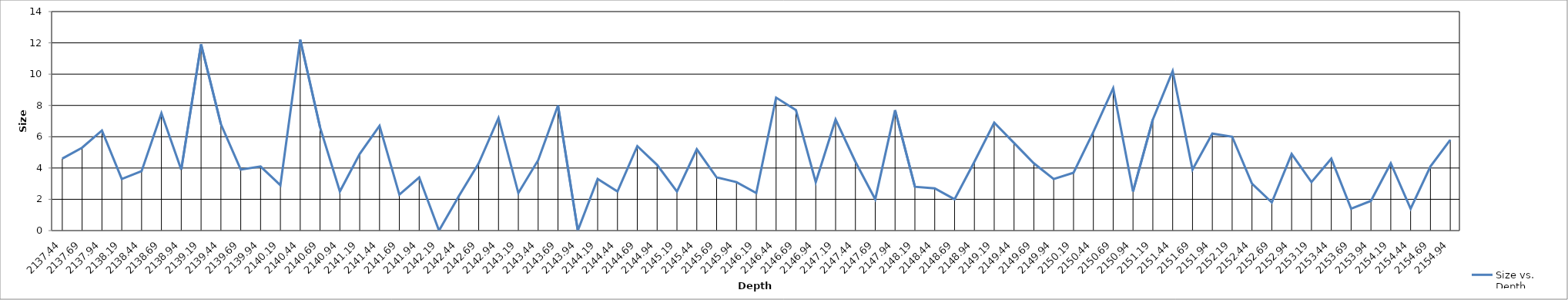
| Category | Size vs. Depth |
|---|---|
| 2137.44 | 4.6 |
| 2137.69 | 5.3 |
| 2137.94 | 6.4 |
| 2138.19 | 3.3 |
| 2138.44 | 3.8 |
| 2138.69 | 7.5 |
| 2138.94 | 3.9 |
| 2139.19 | 11.9 |
| 2139.44 | 6.8 |
| 2139.69 | 3.9 |
| 2139.94 | 4.1 |
| 2140.19 | 2.9 |
| 2140.44 | 12.2 |
| 2140.69 | 6.6 |
| 2140.94 | 2.5 |
| 2141.19 | 4.9 |
| 2141.44 | 6.7 |
| 2141.69 | 2.3 |
| 2141.94 | 3.4 |
| 2142.19 | 0 |
| 2142.44 | 2.2 |
| 2142.69 | 4.3 |
| 2142.94 | 7.2 |
| 2143.19 | 2.4 |
| 2143.44 | 4.5 |
| 2143.69 | 8 |
| 2143.94 | 0 |
| 2144.19 | 3.3 |
| 2144.44 | 2.5 |
| 2144.69 | 5.4 |
| 2144.94 | 4.2 |
| 2145.19 | 2.5 |
| 2145.44 | 5.2 |
| 2145.69 | 3.4 |
| 2145.94 | 3.1 |
| 2146.19 | 2.4 |
| 2146.44 | 8.5 |
| 2146.69 | 7.7 |
| 2146.94 | 3.1 |
| 2147.19 | 7.1 |
| 2147.44 | 4.4 |
| 2147.69 | 2 |
| 2147.94 | 7.7 |
| 2148.19 | 2.8 |
| 2148.44 | 2.7 |
| 2148.69 | 2 |
| 2148.94 | 4.4 |
| 2149.19 | 6.9 |
| 2149.44 | 5.6 |
| 2149.69 | 4.3 |
| 2149.94 | 3.3 |
| 2150.19 | 3.7 |
| 2150.44 | 6.3 |
| 2150.69 | 9.1 |
| 2150.94 | 2.5 |
| 2151.19 | 7.1 |
| 2151.44 | 10.2 |
| 2151.69 | 3.9 |
| 2151.94 | 6.2 |
| 2152.19 | 6 |
| 2152.44 | 3 |
| 2152.69 | 1.8 |
| 2152.94 | 4.9 |
| 2153.19 | 3.1 |
| 2153.44 | 4.6 |
| 2153.69 | 1.4 |
| 2153.94 | 1.9 |
| 2154.19 | 4.3 |
| 2154.44 | 1.4 |
| 2154.69 | 4.1 |
| 2154.94 | 5.8 |